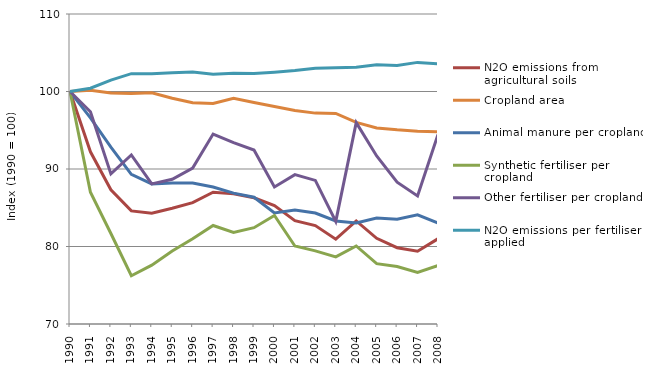
| Category | N2O emissions from agricultural soils | Cropland area | Animal manure per cropland | Synthetic fertiliser per cropland | Other fertiliser per cropland | N2O emissions per fertiliser applied |
|---|---|---|---|---|---|---|
| 1990.0 | 100 | 100 | 100 | 100 | 100 | 100 |
| 1991.0 | 92.22 | 100.166 | 96.592 | 86.997 | 97.389 | 100.419 |
| 1992.0 | 87.321 | 99.804 | 92.827 | 81.677 | 89.368 | 101.479 |
| 1993.0 | 84.592 | 99.73 | 89.306 | 76.23 | 91.818 | 102.305 |
| 1994.0 | 84.284 | 99.836 | 88.078 | 77.589 | 88.085 | 102.288 |
| 1995.0 | 84.932 | 99.124 | 88.193 | 79.414 | 88.678 | 102.428 |
| 1996.0 | 85.662 | 98.556 | 88.204 | 81 | 90.127 | 102.506 |
| 1997.0 | 87.009 | 98.447 | 87.675 | 82.709 | 94.51 | 102.223 |
| 1998.0 | 86.818 | 99.137 | 86.89 | 81.823 | 93.403 | 102.36 |
| 1999.0 | 86.282 | 98.591 | 86.362 | 82.424 | 92.452 | 102.312 |
| 2000.0 | 85.271 | 98.065 | 84.336 | 84.001 | 87.681 | 102.481 |
| 2001.0 | 83.343 | 97.546 | 84.711 | 80.065 | 89.274 | 102.697 |
| 2002.0 | 82.702 | 97.211 | 84.322 | 79.434 | 88.525 | 102.99 |
| 2003.0 | 80.949 | 97.17 | 83.288 | 78.653 | 83.239 | 103.068 |
| 2004.0 | 83.305 | 96.017 | 83.03 | 80.072 | 95.987 | 103.115 |
| 2005.0 | 81.061 | 95.302 | 83.672 | 77.785 | 91.684 | 103.459 |
| 2006.0 | 79.844 | 95.052 | 83.527 | 77.419 | 88.303 | 103.344 |
| 2007.0 | 79.398 | 94.869 | 84.093 | 76.659 | 86.516 | 103.756 |
| 2008.0 | 80.997 | 94.802 | 83.033 | 77.542 | 94.44 | 103.582 |